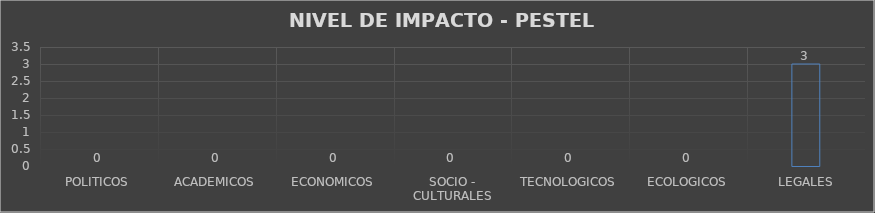
| Category | Series 0 |
|---|---|
| POLITICOS | 0 |
| ACADEMICOS | 0 |
| ECONOMICOS | 0 |
| SOCIO - CULTURALES | 0 |
| TECNOLOGICOS | 0 |
| ECOLOGICOS | 0 |
| LEGALES | 3 |